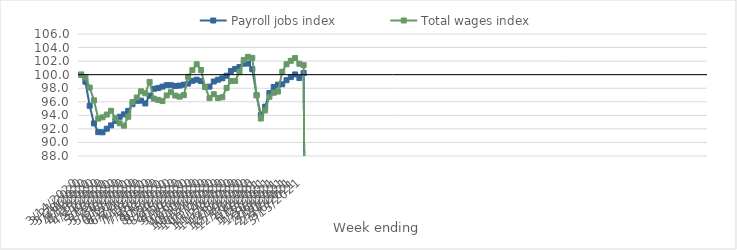
| Category | Payroll jobs index | Total wages index |
|---|---|---|
| 14/03/2020 | 100 | 100 |
| 21/03/2020 | 98.956 | 99.571 |
| 28/03/2020 | 95.411 | 98.095 |
| 04/04/2020 | 92.814 | 96.217 |
| 11/04/2020 | 91.522 | 93.51 |
| 18/04/2020 | 91.499 | 93.706 |
| 25/04/2020 | 92.024 | 94.115 |
| 02/05/2020 | 92.518 | 94.669 |
| 09/05/2020 | 93.198 | 93.587 |
| 16/05/2020 | 93.789 | 92.821 |
| 23/05/2020 | 94.145 | 92.476 |
| 30/05/2020 | 94.654 | 93.783 |
| 06/06/2020 | 95.642 | 95.969 |
| 13/06/2020 | 96.146 | 96.63 |
| 20/06/2020 | 96.166 | 97.54 |
| 27/06/2020 | 95.757 | 97.254 |
| 04/07/2020 | 96.891 | 98.931 |
| 11/07/2020 | 97.918 | 96.452 |
| 18/07/2020 | 98.015 | 96.287 |
| 25/07/2020 | 98.234 | 96.104 |
| 01/08/2020 | 98.45 | 96.943 |
| 08/08/2020 | 98.442 | 97.412 |
| 15/08/2020 | 98.335 | 96.914 |
| 22/08/2020 | 98.39 | 96.757 |
| 29/08/2020 | 98.521 | 96.978 |
| 05/09/2020 | 98.687 | 99.677 |
| 12/09/2020 | 99.091 | 100.68 |
| 19/09/2020 | 99.254 | 101.536 |
| 26/09/2020 | 99.049 | 100.689 |
| 03/10/2020 | 98.196 | 98.175 |
| 10/10/2020 | 98.237 | 96.534 |
| 17/10/2020 | 98.99 | 97.113 |
| 24/10/2020 | 99.254 | 96.552 |
| 31/10/2020 | 99.461 | 96.668 |
| 07/11/2020 | 99.844 | 98.053 |
| 14/11/2020 | 100.553 | 99.053 |
| 21/11/2020 | 100.846 | 99.075 |
| 28/11/2020 | 101.126 | 100.407 |
| 05/12/2020 | 101.622 | 102.179 |
| 12/12/2020 | 101.647 | 102.628 |
| 19/12/2020 | 100.808 | 102.478 |
| 26/12/2020 | 96.977 | 96.957 |
| 02/01/2021 | 94.05 | 93.527 |
| 09/01/2021 | 95.274 | 94.722 |
| 16/01/2021 | 97.292 | 96.737 |
| 23/01/2021 | 98.18 | 97.336 |
| 30/01/2021 | 98.522 | 97.507 |
| 06/02/2021 | 98.581 | 100.419 |
| 13/02/2021 | 99.185 | 101.54 |
| 20/02/2021 | 99.643 | 102.046 |
| 27/02/2021 | 100.036 | 102.451 |
| 06/03/2021 | 99.503 | 101.603 |
| 13/03/2021 | 100.244 | 101.4 |